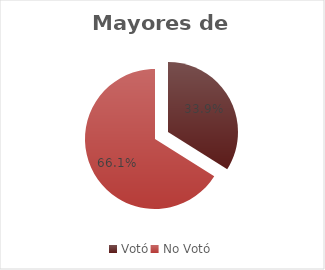
| Category | 80+ |
|---|---|
| Votó | 0.339 |
| No Votó | 0.661 |